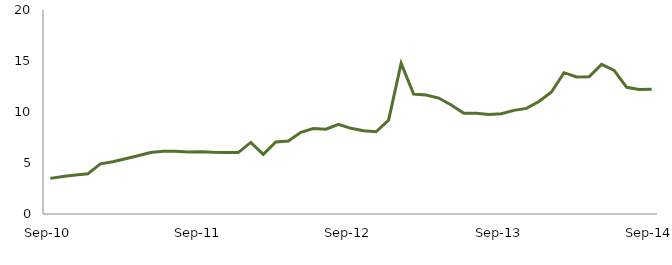
| Category | Series 0 |
|---|---|
| Sep-10 | 3.493 |
|  | 3.666 |
|  | 3.83 |
|  | 3.94 |
|  | 4.916 |
|  | 5.126 |
|  | 5.419 |
|  | 5.714 |
|  | 6.026 |
|  | 6.157 |
|  | 6.159 |
|  | 6.071 |
| Sep-11 | 6.101 |
|  | 6.047 |
|  | 6.024 |
|  | 6.023 |
|  | 7.02 |
|  | 5.854 |
|  | 7.066 |
|  | 7.148 |
|  | 8.003 |
|  | 8.373 |
|  | 8.316 |
|  | 8.796 |
| Sep-12 | 8.398 |
|  | 8.159 |
|  | 8.058 |
|  | 9.197 |
|  | 14.769 |
|  | 11.758 |
|  | 11.668 |
|  | 11.366 |
|  | 10.68 |
|  | 9.881 |
|  | 9.866 |
|  | 9.756 |
| Sep-13 | 9.834 |
|  | 10.159 |
|  | 10.356 |
|  | 11.024 |
|  | 11.964 |
|  | 13.855 |
|  | 13.442 |
|  | 13.452 |
|  | 14.665 |
|  | 14.072 |
|  | 12.418 |
|  | 12.198 |
| Sep-14 | 12.235 |